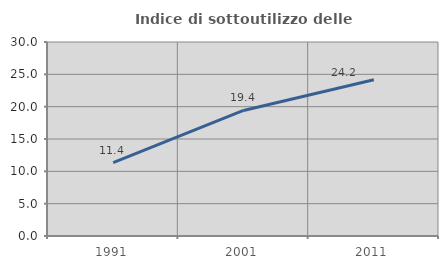
| Category | Indice di sottoutilizzo delle abitazioni  |
|---|---|
| 1991.0 | 11.354 |
| 2001.0 | 19.417 |
| 2011.0 | 24.157 |